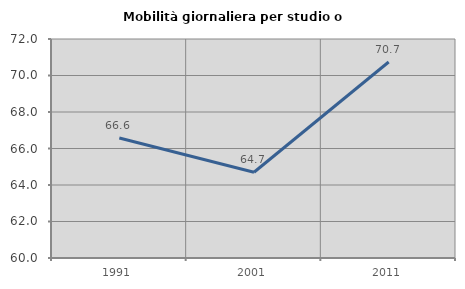
| Category | Mobilità giornaliera per studio o lavoro |
|---|---|
| 1991.0 | 66.575 |
| 2001.0 | 64.701 |
| 2011.0 | 70.742 |